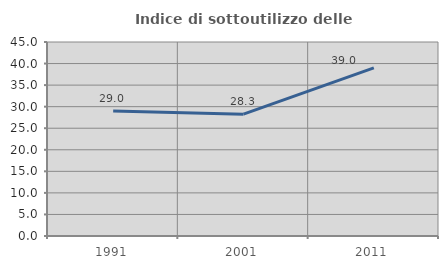
| Category | Indice di sottoutilizzo delle abitazioni  |
|---|---|
| 1991.0 | 28.994 |
| 2001.0 | 28.264 |
| 2011.0 | 38.986 |